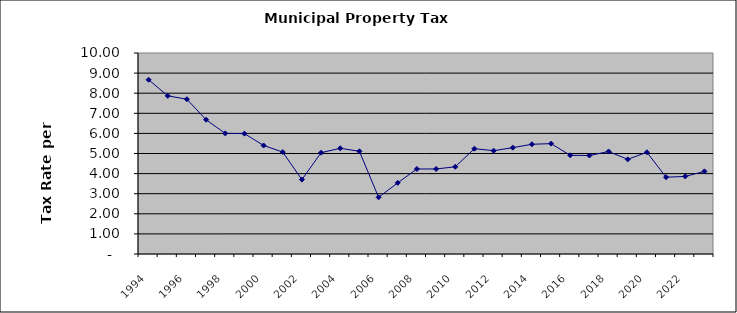
| Category | Rate |
|---|---|
| 1994.0 | 8.67 |
| 1995.0 | 7.87 |
| 1996.0 | 7.7 |
| 1997.0 | 6.68 |
| 1998.0 | 6 |
| 1999.0 | 5.99 |
| 2000.0 | 5.4 |
| 2001.0 | 5.07 |
| 2002.0 | 3.7 |
| 2003.0 | 5.04 |
| 2004.0 | 5.26 |
| 2005.0 | 5.11 |
| 2006.0 | 2.82 |
| 2007.0 | 3.54 |
| 2008.0 | 4.23 |
| 2009.0 | 4.23 |
| 2010.0 | 4.34 |
| 2011.0 | 5.24 |
| 2012.0 | 5.14 |
| 2013.0 | 5.29 |
| 2014.0 | 5.46 |
| 2015.0 | 5.49 |
| 2016.0 | 4.91 |
| 2017.0 | 4.9 |
| 2018.0 | 5.1 |
| 2019.0 | 4.71 |
| 2020.0 | 5.06 |
| 2021.0 | 3.82 |
| 2022.0 | 3.86 |
| 2023.0 | 4.11 |